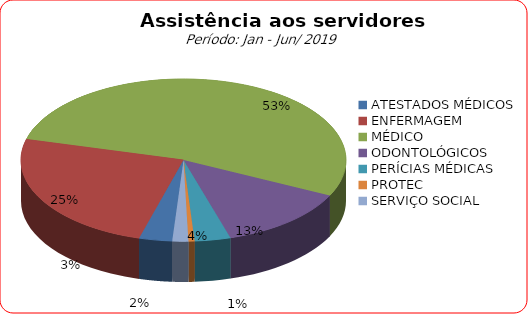
| Category | Series 0 |
|---|---|
| ATESTADOS MÉDICOS | 3.283 |
| ENFERMAGEM | 24.705 |
| MÉDICO | 53.108 |
| ODONTOLÓGICOS | 13.134 |
| PERÍCIAS MÉDICAS | 3.57 |
| PROTEC | 0.606 |
| SERVIÇO SOCIAL | 1.594 |